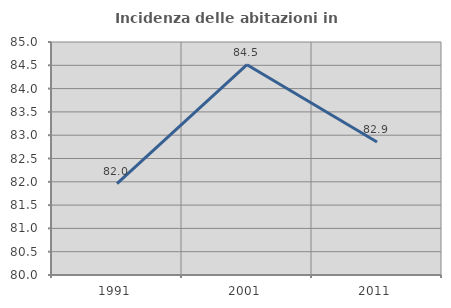
| Category | Incidenza delle abitazioni in proprietà  |
|---|---|
| 1991.0 | 81.961 |
| 2001.0 | 84.514 |
| 2011.0 | 82.855 |